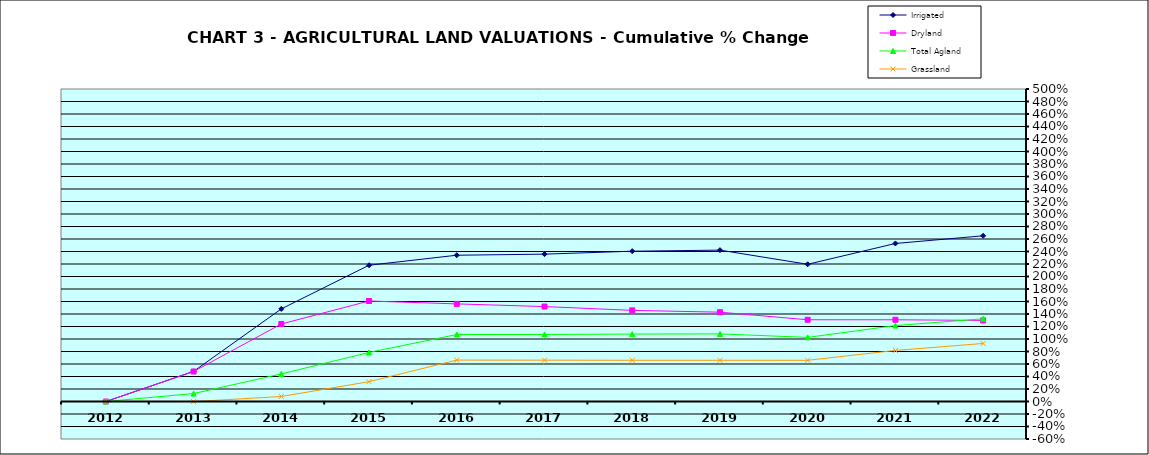
| Category | Irrigated | Dryland | Total Agland | Grassland |
|---|---|---|---|---|
| 2012.0 | 0 | 0 | 0 | 0 |
| 2013.0 | 0.482 | 0.48 | 0.127 | -0.002 |
| 2014.0 | 1.482 | 1.24 | 0.441 | 0.08 |
| 2015.0 | 2.18 | 1.608 | 0.785 | 0.317 |
| 2016.0 | 2.34 | 1.562 | 1.072 | 0.663 |
| 2017.0 | 2.358 | 1.519 | 1.073 | 0.661 |
| 2018.0 | 2.405 | 1.458 | 1.079 | 0.66 |
| 2019.0 | 2.422 | 1.429 | 1.081 | 0.66 |
| 2020.0 | 2.195 | 1.308 | 1.026 | 0.659 |
| 2021.0 | 2.529 | 1.308 | 1.215 | 0.817 |
| 2022.0 | 2.651 | 1.297 | 1.323 | 0.928 |